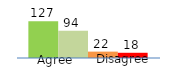
| Category | Series 0 | Series 1 | Series 2 | Series 3 |
|---|---|---|---|---|
| 0 | 127 | 94 | 22 | 18 |